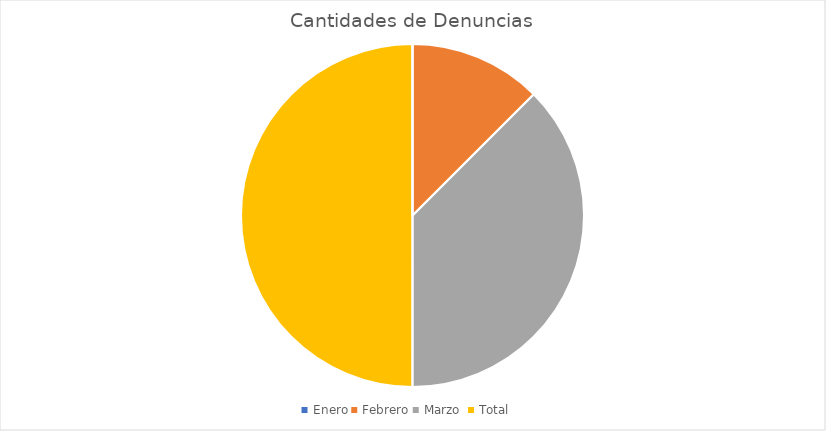
| Category | Cantidades de Denuncias |
|---|---|
| Enero | 0 |
| Febrero | 1 |
| Marzo  | 3 |
| Total  | 4 |